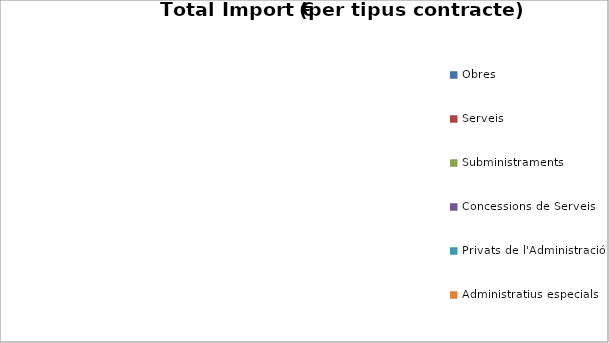
| Category | Total preu              (amb iva) |
|---|---|
| Obres | 0 |
| Serveis | 0 |
| Subministraments | 0 |
| Concessions de Serveis | 0 |
| Privats de l'Administració | 0 |
| Administratius especials | 0 |